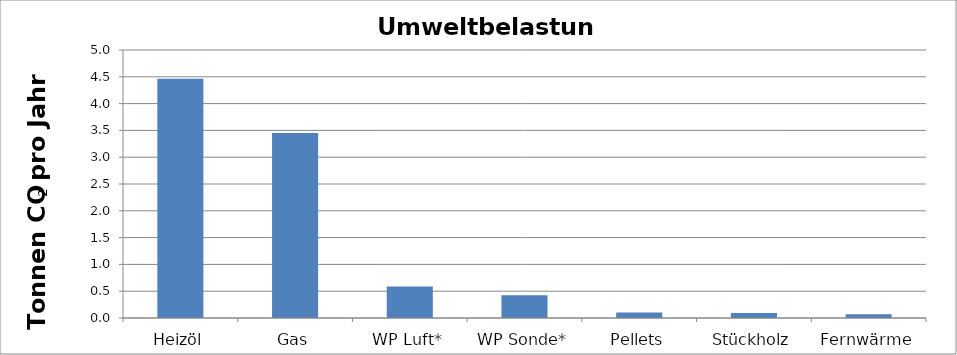
| Category | Umweltbelastung |
|---|---|
| Heizöl | 4.466 |
| Gas | 3.45 |
| WP Luft* | 0.588 |
| WP Sonde* | 0.425 |
| Pellets | 0.103 |
| Stückholz | 0.092 |
| Fernwärme | 0.069 |